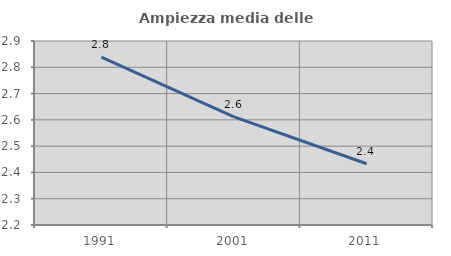
| Category | Ampiezza media delle famiglie |
|---|---|
| 1991.0 | 2.839 |
| 2001.0 | 2.611 |
| 2011.0 | 2.433 |